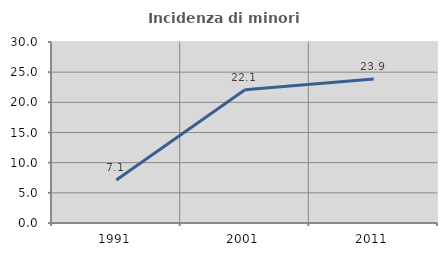
| Category | Incidenza di minori stranieri |
|---|---|
| 1991.0 | 7.143 |
| 2001.0 | 22.069 |
| 2011.0 | 23.872 |